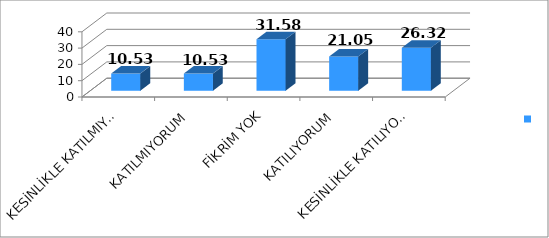
| Category | Series 0 |
|---|---|
| KESİNLİKLE KATILMIYORUM | 10.53 |
| KATILMIYORUM | 10.53 |
| FİKRİM YOK | 31.58 |
| KATILIYORUM | 21.05 |
| KESİNLİKLE KATILIYORUM | 26.32 |